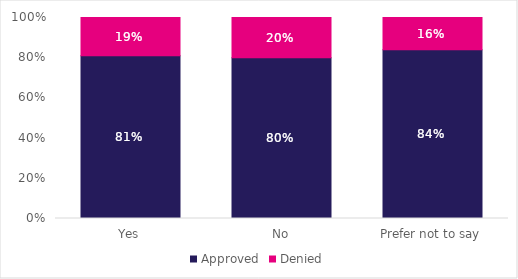
| Category | Approved | Denied |
|---|---|---|
| Yes | 0.81 | 0.19 |
| No | 0.8 | 0.2 |
| Prefer not to say | 0.84 | 0.16 |